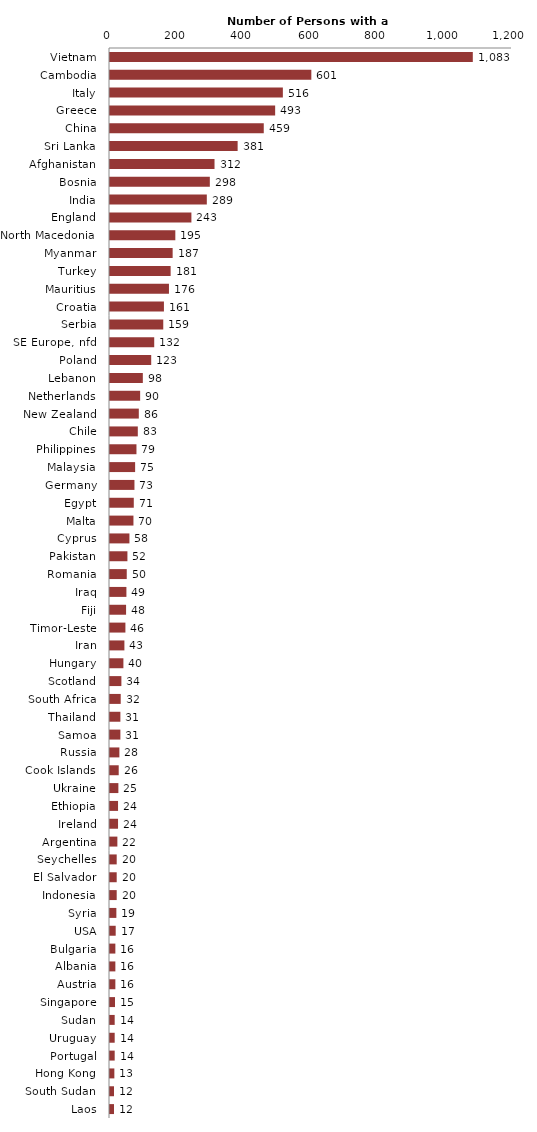
| Category | Series 0 |
|---|---|
| Vietnam | 1083 |
| Cambodia | 601 |
| Italy | 516 |
| Greece | 493 |
| China | 459 |
| Sri Lanka | 381 |
| Afghanistan | 312 |
| Bosnia | 298 |
| India | 289 |
| England | 243 |
| North Macedonia | 195 |
| Myanmar | 187 |
| Turkey | 181 |
| Mauritius | 176 |
| Croatia | 161 |
| Serbia | 159 |
| SE Europe, nfd | 132 |
| Poland | 123 |
| Lebanon | 98 |
| Netherlands | 90 |
| New Zealand | 86 |
| Chile | 83 |
| Philippines | 79 |
| Malaysia | 75 |
| Germany | 73 |
| Egypt | 71 |
| Malta | 70 |
| Cyprus | 58 |
| Pakistan | 52 |
| Romania | 50 |
| Iraq | 49 |
| Fiji | 48 |
| Timor-Leste | 46 |
| Iran | 43 |
| Hungary | 40 |
| Scotland | 34 |
| South Africa | 32 |
| Thailand | 31 |
| Samoa | 31 |
| Russia | 28 |
| Cook Islands | 26 |
| Ukraine | 25 |
| Ethiopia | 24 |
| Ireland | 24 |
| Argentina | 22 |
| Seychelles | 20 |
| El Salvador | 20 |
| Indonesia | 20 |
| Syria | 19 |
| USA | 17 |
| Bulgaria | 16 |
| Albania | 16 |
| Austria | 16 |
| Singapore | 15 |
| Sudan | 14 |
| Uruguay | 14 |
| Portugal | 14 |
| Hong Kong | 13 |
| South Sudan | 12 |
| Laos | 12 |